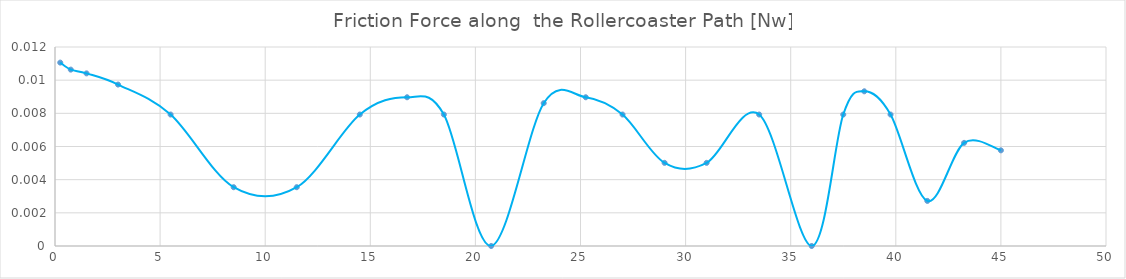
| Category | x    [in] |
|---|---|
| 0.25 | 0.011 |
| 0.75 | 0.011 |
| 1.5 | 0.01 |
| 3.0 | 0.01 |
| 5.5 | 0.008 |
| 8.5 | 0.004 |
| 11.5 | 0.004 |
| 14.5 | 0.008 |
| 16.75 | 0.009 |
| 18.5 | 0.008 |
| 20.75 | 0 |
| 23.25 | 0.009 |
| 25.25 | 0.009 |
| 27.0 | 0.008 |
| 29.0 | 0.005 |
| 31.0 | 0.005 |
| 33.5 | 0.008 |
| 36.0 | 0 |
| 37.5 | 0.008 |
| 38.5 | 0.009 |
| 39.75 | 0.008 |
| 41.5 | 0.003 |
| 43.25 | 0.006 |
| 45.0 | 0.006 |